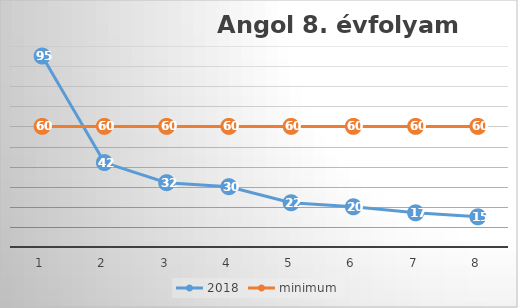
| Category | 2018 | minimum |
|---|---|---|
| 0 | 95 | 60 |
| 1 | 42 | 60 |
| 2 | 32 | 60 |
| 3 | 30 | 60 |
| 4 | 22 | 60 |
| 5 | 20 | 60 |
| 6 | 17 | 60 |
| 7 | 15 | 60 |